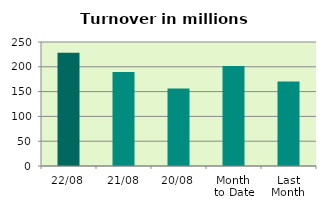
| Category | Series 0 |
|---|---|
| 22/08 | 228.346 |
| 21/08 | 189.646 |
| 20/08 | 156.131 |
| Month 
to Date | 201.413 |
| Last
Month | 170.387 |